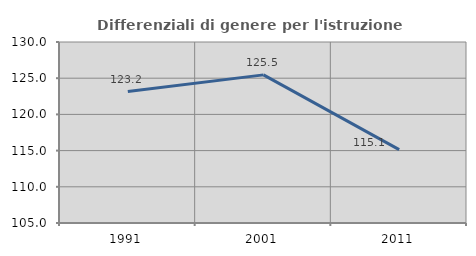
| Category | Differenziali di genere per l'istruzione superiore |
|---|---|
| 1991.0 | 123.16 |
| 2001.0 | 125.459 |
| 2011.0 | 115.14 |